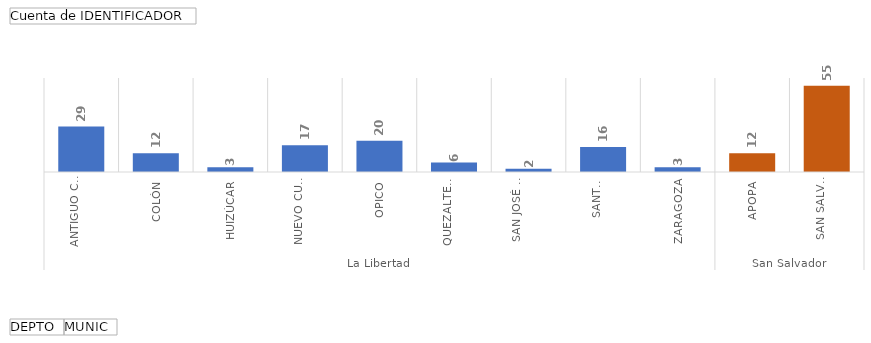
| Category | Total |
|---|---|
| 0 | 29 |
| 1 | 12 |
| 2 | 3 |
| 3 | 17 |
| 4 | 20 |
| 5 | 6 |
| 6 | 2 |
| 7 | 16 |
| 8 | 3 |
| 9 | 12 |
| 10 | 55 |